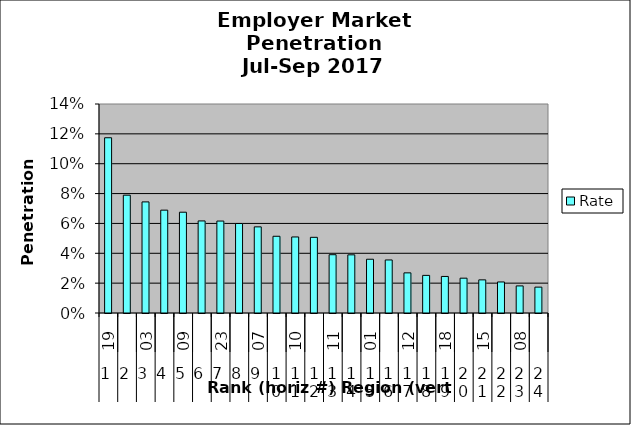
| Category | Rate |
|---|---|
| 0 | 0.117 |
| 1 | 0.079 |
| 2 | 0.074 |
| 3 | 0.069 |
| 4 | 0.068 |
| 5 | 0.062 |
| 6 | 0.062 |
| 7 | 0.06 |
| 8 | 0.058 |
| 9 | 0.051 |
| 10 | 0.051 |
| 11 | 0.051 |
| 12 | 0.039 |
| 13 | 0.039 |
| 14 | 0.036 |
| 15 | 0.036 |
| 16 | 0.027 |
| 17 | 0.025 |
| 18 | 0.024 |
| 19 | 0.023 |
| 20 | 0.022 |
| 21 | 0.021 |
| 22 | 0.018 |
| 23 | 0.017 |